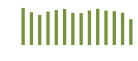
| Category | Saldo [ (1)-(2) ] |
|---|---|
| 0 | 329612.931 |
| 1 | 291358.085 |
| 2 | 266512.131 |
| 3 | 297562.723 |
| 4 | 310243.352 |
| 5 | 320714.531 |
| 6 | 286229.119 |
| 7 | 282809.198 |
| 8 | 306315.684 |
| 9 | 322195.815 |
| 10 | 306185.726 |
| 11 | 300797.708 |
| 12 | 287185.489 |
| 13 | 229607.519 |